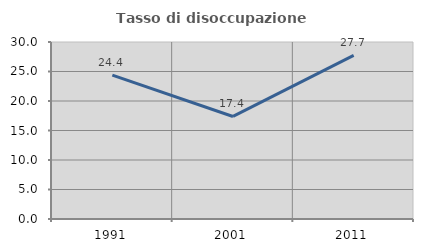
| Category | Tasso di disoccupazione giovanile  |
|---|---|
| 1991.0 | 24.376 |
| 2001.0 | 17.38 |
| 2011.0 | 27.726 |